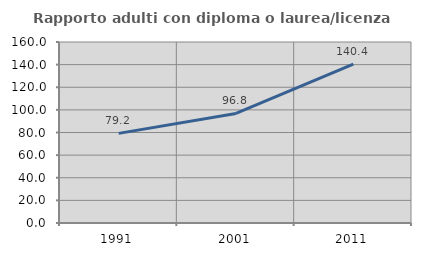
| Category | Rapporto adulti con diploma o laurea/licenza media  |
|---|---|
| 1991.0 | 79.221 |
| 2001.0 | 96.835 |
| 2011.0 | 140.419 |